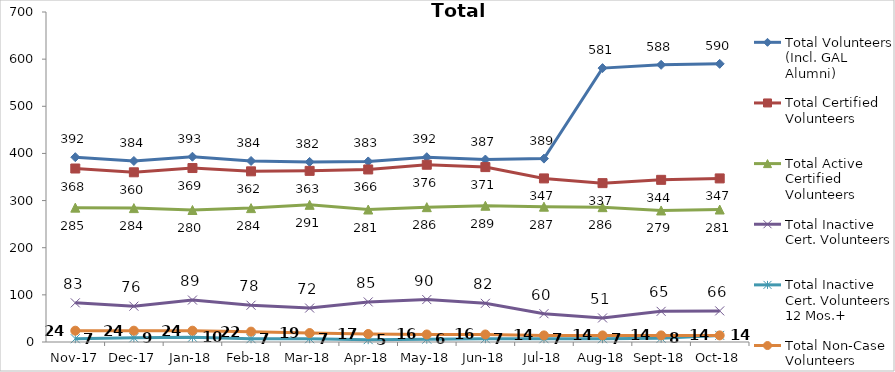
| Category | Total Volunteers (Incl. GAL Alumni) | Total Certified Volunteers | Total Active Certified Volunteers | Total Inactive Cert. Volunteers | Total Inactive Cert. Volunteers 12 Mos.+ | Total Non-Case Volunteers |
|---|---|---|---|---|---|---|
| 2017-11-01 | 392 | 368 | 285 | 83 | 7 | 24 |
| 2017-12-01 | 384 | 360 | 284 | 76 | 9 | 24 |
| 2018-01-01 | 393 | 369 | 280 | 89 | 10 | 24 |
| 2018-02-01 | 384 | 362 | 284 | 78 | 7 | 22 |
| 2018-03-01 | 382 | 363 | 291 | 72 | 7 | 19 |
| 2018-04-01 | 383 | 366 | 281 | 85 | 5 | 17 |
| 2018-05-01 | 392 | 376 | 286 | 90 | 6 | 16 |
| 2018-06-01 | 387 | 371 | 289 | 82 | 7 | 16 |
| 2018-07-01 | 389 | 347 | 287 | 60 | 7 | 14 |
| 2018-08-01 | 581 | 337 | 286 | 51 | 7 | 14 |
| 2018-09-01 | 588 | 344 | 279 | 65 | 8 | 14 |
| 2018-10-01 | 590 | 347 | 281 | 66 | 14 | 14 |